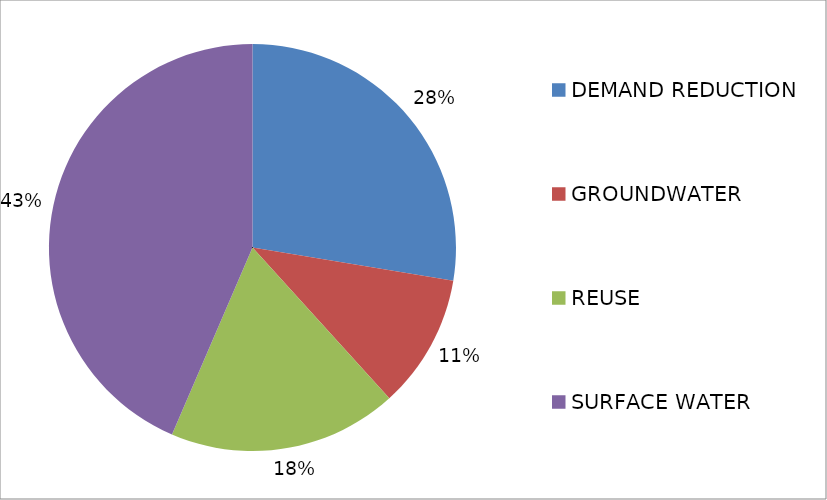
| Category | Series 0 |
|---|---|
| DEMAND REDUCTION | 780743 |
| GROUNDWATER | 301461 |
| REUSE | 514905 |
| SURFACE WATER | 1230865 |